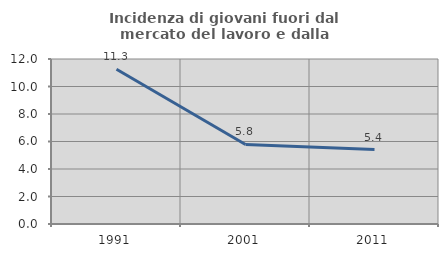
| Category | Incidenza di giovani fuori dal mercato del lavoro e dalla formazione  |
|---|---|
| 1991.0 | 11.255 |
| 2001.0 | 5.785 |
| 2011.0 | 5.41 |